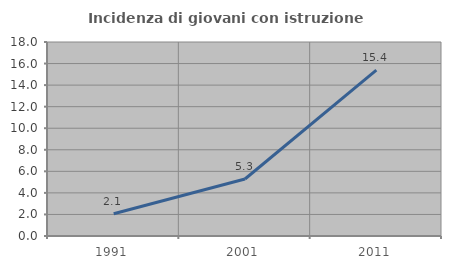
| Category | Incidenza di giovani con istruzione universitaria |
|---|---|
| 1991.0 | 2.069 |
| 2001.0 | 5.291 |
| 2011.0 | 15.385 |